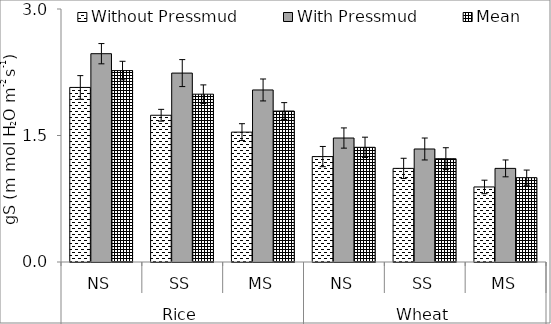
| Category | Without Pressmud | With Pressmud | Mean |
|---|---|---|---|
| 0 | 2.07 | 2.47 | 2.27 |
| 1 | 1.74 | 2.24 | 1.99 |
| 2 | 1.54 | 2.04 | 1.79 |
| 3 | 1.25 | 1.47 | 1.36 |
| 4 | 1.11 | 1.34 | 1.225 |
| 5 | 0.89 | 1.11 | 1 |